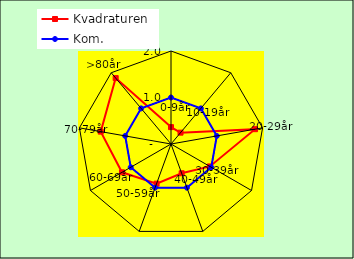
| Category | Kvadraturen | Kom. |
|---|---|---|
| 0-9år | 0.363 | 1 |
| 10-19år | 0.319 | 1 |
| 20-29år | 1.835 | 1 |
| 30-39år | 0.965 | 1 |
| 40-49år | 0.67 | 1 |
| 50-59år | 0.907 | 1 |
| 60-69år | 1.218 | 1 |
| 70-79år | 1.534 | 1 |
| >80år | 1.851 | 1 |